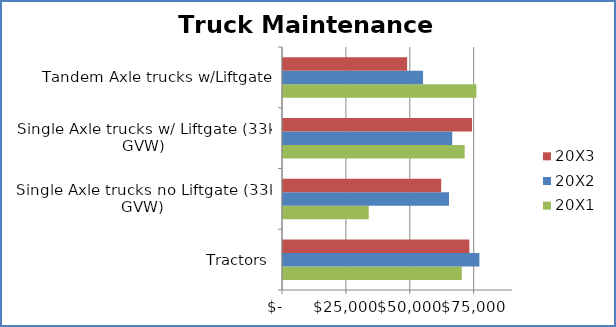
| Category | 20X1 | 20X2 | 20X3 |
|---|---|---|---|
| Tractors | 69957 | 76850 | 72917 |
| Single Axle trucks no Liftgate (33k GVW) | 33535 | 64957 | 61909 |
| Single Axle trucks w/ Liftgate (33k GVW) | 71098 | 66224 | 73982 |
| Tandem Axle trucks w/Liftgate | 75680 | 54809 | 48576 |